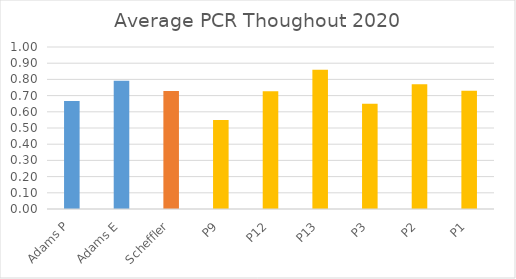
| Category | Series 0 |
|---|---|
| Adams P | 0.667 |
| Adams E | 0.791 |
| Scheffler | 0.729 |
| P9 | 0.55 |
| P12 | 0.727 |
| P13 | 0.86 |
| P3 | 0.65 |
| P2 | 0.77 |
| P1 | 0.73 |